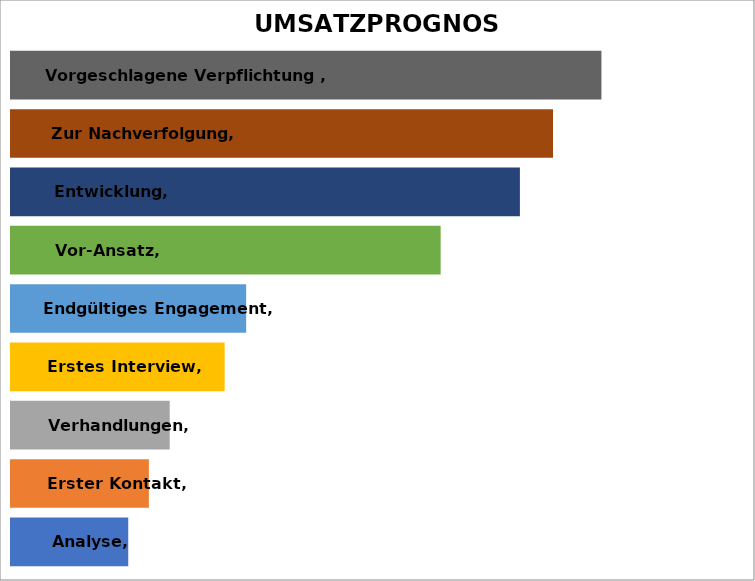
| Category | UMSATZPROGNOSE |
|---|---|
| Analyse | 38284 |
| Erster Kontakt | 45025 |
| Verhandlungen | 51821 |
| Erstes Interview | 69758 |
| Endgültiges Engagement | 76787 |
| Vor-Ansatz | 140291 |
| Entwicklung | 166174 |
| Zur Nachverfolgung | 176982 |
| Vorgeschlagene Verpflichtung  | 192792 |